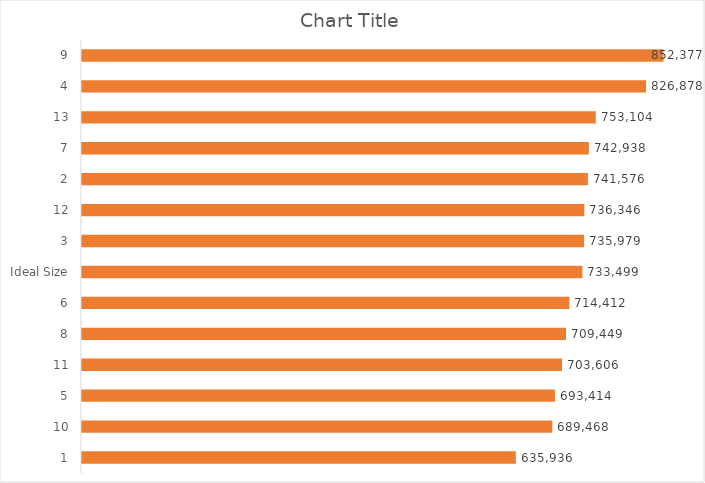
| Category | Series 1 |
|---|---|
| 1 | 635936 |
| 10 | 689468 |
| 5 | 693414 |
| 11 | 703606 |
| 8 | 709449 |
| 6 | 714412 |
| Ideal Size | 733499 |
| 3 | 735979 |
| 12 | 736346 |
| 2 | 741576 |
| 7 | 742938 |
| 13 | 753104 |
| 4 | 826878 |
| 9 | 852377 |